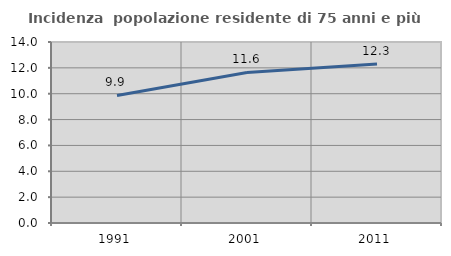
| Category | Incidenza  popolazione residente di 75 anni e più |
|---|---|
| 1991.0 | 9.868 |
| 2001.0 | 11.643 |
| 2011.0 | 12.301 |